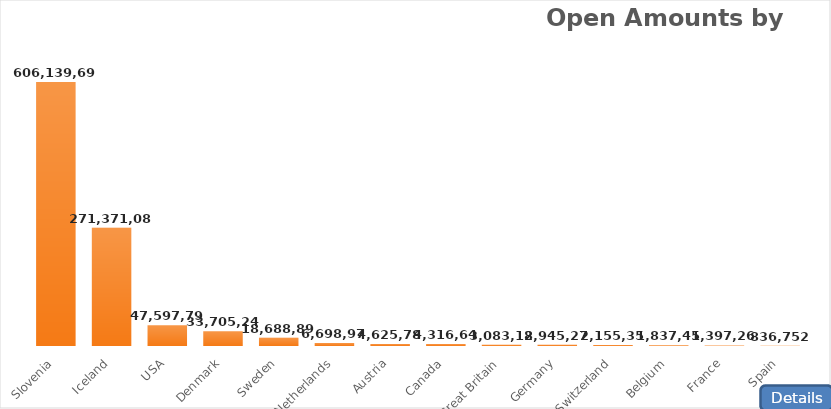
| Category | Total |
|---|---|
| Slovenia | 606139690.5 |
| Iceland | 271371087.29 |
| USA | 47597790.44 |
| Denmark | 33705244.82 |
| Sweden | 18688899.02 |
| Netherlands | 6698978.87 |
| Austria | 4625785.02 |
| Canada | 4316645.04 |
| Great Britain | 3083180.5 |
| Germany | 2945274.62 |
| Switzerland | 2155352.59 |
| Belgium | 1837458.3 |
| France | 1397263.72 |
| Spain | 836751.93 |